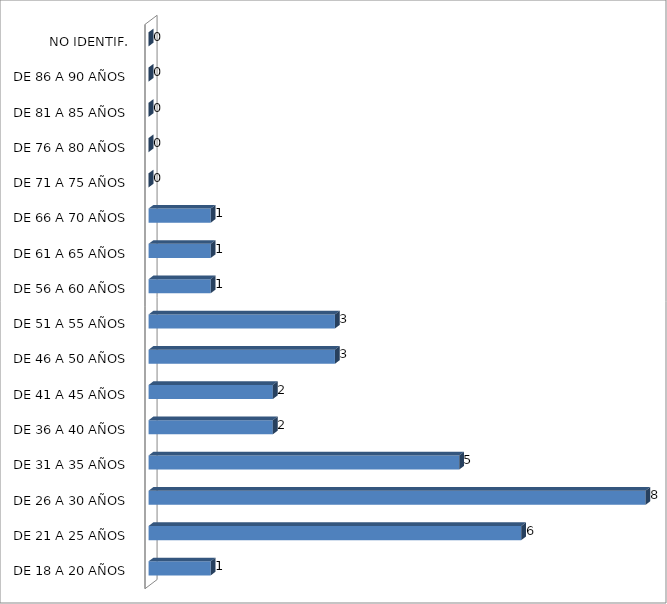
| Category | ESTADO  DE EBRIEDAD |
|---|---|
| DE 18 A 20 AÑOS | 1 |
| DE 21 A 25 AÑOS | 6 |
| DE 26 A 30 AÑOS | 8 |
| DE 31 A 35 AÑOS | 5 |
| DE 36 A 40 AÑOS | 2 |
| DE 41 A 45 AÑOS | 2 |
| DE 46 A 50 AÑOS | 3 |
| DE 51 A 55 AÑOS | 3 |
| DE 56 A 60 AÑOS | 1 |
| DE 61 A 65 AÑOS | 1 |
| DE 66 A 70 AÑOS | 1 |
| DE 71 A 75 AÑOS | 0 |
| DE 76 A 80 AÑOS | 0 |
| DE 81 A 85 AÑOS | 0 |
| DE 86 A 90 AÑOS | 0 |
| NO IDENTIF. | 0 |